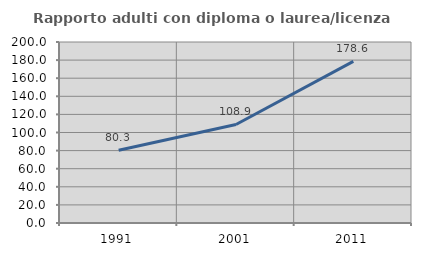
| Category | Rapporto adulti con diploma o laurea/licenza media  |
|---|---|
| 1991.0 | 80.323 |
| 2001.0 | 108.854 |
| 2011.0 | 178.609 |